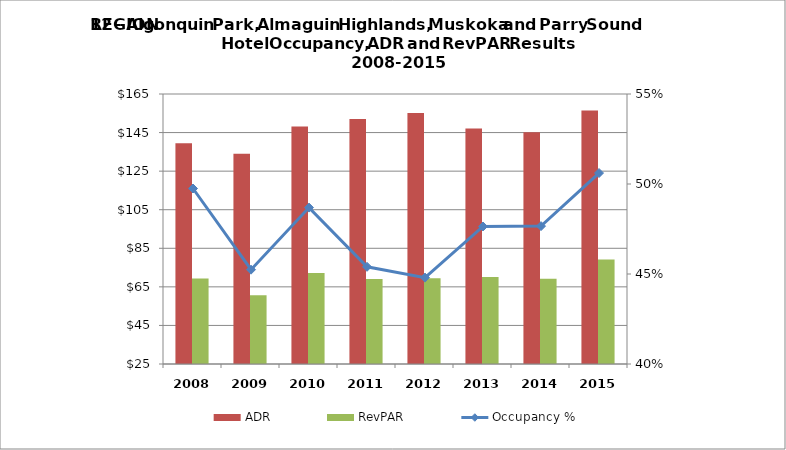
| Category | ADR | RevPAR |
|---|---|---|
| 2008.0 | 139.44 | 69.371 |
| 2009.0 | 134.01 | 60.626 |
| 2010.0 | 148.18 | 72.149 |
| 2011.0 | 152.05 | 69.031 |
| 2012.0 | 155.18 | 69.521 |
| 2013.0 | 147.15 | 70.102 |
| 2014.0 | 145.11 | 69.159 |
| 2015.0 | 156.39 | 79.15 |